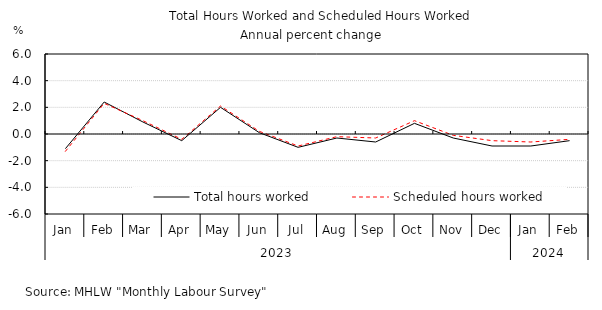
| Category | Total hours worked | Scheduled hours worked |
|---|---|---|
| 0 | -1.1 | -1.3 |
| 1 | 2.4 | 2.3 |
| 2 | 0.9 | 1 |
| 3 | -0.5 | -0.4 |
| 4 | 2 | 2.1 |
| 5 | 0.1 | 0.2 |
| 6 | -1 | -0.9 |
| 7 | -0.3 | -0.2 |
| 8 | -0.6 | -0.3 |
| 9 | 0.8 | 1 |
| 10 | -0.3 | -0.1 |
| 11 | -0.9 | -0.5 |
| 12 | -0.9 | -0.6 |
| 13 | -0.5 | -0.4 |